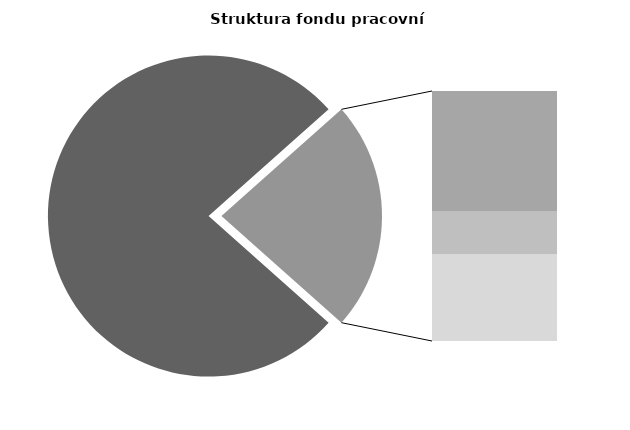
| Category | Series 0 |
|---|---|
| Průměrná měsíční odpracovaná doba bez přesčasu | 133.62 |
| Dovolená | 19.286 |
| Nemoc | 6.935 |
| Jiné | 13.979 |